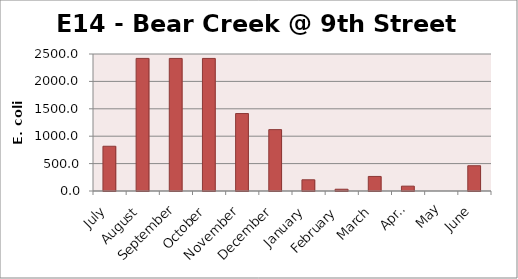
| Category | E. coli MPN |
|---|---|
| July | 816.4 |
| August | 2419.6 |
| September | 2419.2 |
| October | 2419.2 |
| November | 1413.6 |
| December | 1119.9 |
| January | 204.6 |
| February | 32.3 |
| March | 265.6 |
| April | 88.6 |
| May | 0 |
| June | 461.1 |